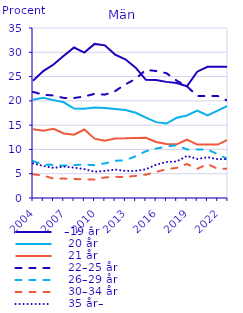
| Category |   –19 år |    20 år |    21 år |    22–25 år |    26–29 år |    30–34 år |    35 år– |
|---|---|---|---|---|---|---|---|
| 2004.0 | 24.146 | 20.249 | 14.135 | 21.848 | 7.601 | 4.9 | 7.12 |
| 2005.0 | 26.123 | 20.637 | 13.871 | 21.254 | 6.89 | 4.622 | 6.603 |
| 2006.0 | 27.487 | 20.155 | 14.257 | 21.108 | 6.808 | 3.989 | 6.196 |
| 2007.0 | 29.271 | 19.701 | 13.29 | 20.589 | 6.682 | 4.005 | 6.461 |
| 2008.0 | 30.982 | 18.422 | 13.04 | 20.595 | 6.791 | 3.911 | 6.259 |
| 2009.0 | 29.947 | 18.381 | 14.103 | 20.89 | 6.876 | 3.852 | 5.952 |
| 2010.0 | 31.726 | 18.636 | 12.214 | 21.446 | 6.76 | 3.809 | 5.409 |
| 2011.0 | 31.432 | 18.554 | 11.805 | 21.276 | 7.117 | 4.227 | 5.59 |
| 2012.0 | 29.532 | 18.323 | 12.264 | 22.006 | 7.656 | 4.356 | 5.863 |
| 2013.0 | 28.554 | 18.105 | 12.283 | 23.382 | 7.781 | 4.332 | 5.564 |
| 2014.0 | 26.836 | 17.541 | 12.371 | 24.538 | 8.59 | 4.554 | 5.57 |
| 2015.0 | 24.335 | 16.529 | 12.397 | 26.387 | 9.632 | 4.806 | 5.914 |
| 2016.0 | 24.301 | 15.617 | 11.546 | 26.143 | 10.162 | 5.365 | 6.865 |
| 2017.0 | 23.908 | 15.323 | 11.11 | 25.71 | 10.616 | 5.919 | 7.414 |
| 2018.0 | 23.689 | 16.512 | 11.05 | 24.163 | 10.856 | 6.209 | 7.52 |
| 2019.0 | 23 | 17 | 12 | 23 | 10 | 7 | 8.664 |
| 2020.0 | 26 | 18 | 11 | 21 | 10 | 6 | 8.034 |
| 2021.0 | 27 | 17 | 11 | 21 | 10 | 7 | 8.388 |
| 2022.0 | 27 | 18 | 11 | 21 | 9 | 6 | 8 |
| 2023.0 | 27 | 19 | 12 | 20 | 8 | 6 | 8 |